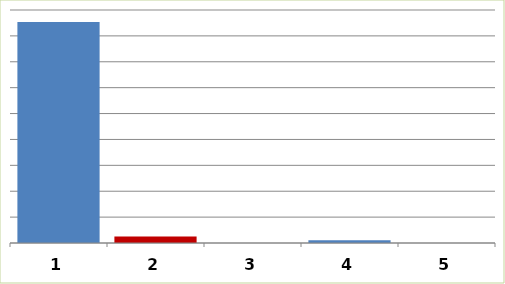
| Category | Series 0 |
|---|---|
| 0 | 4268160.75 |
| 1 | 123150 |
| 2 | 0 |
| 3 | 52920 |
| 4 | 0 |